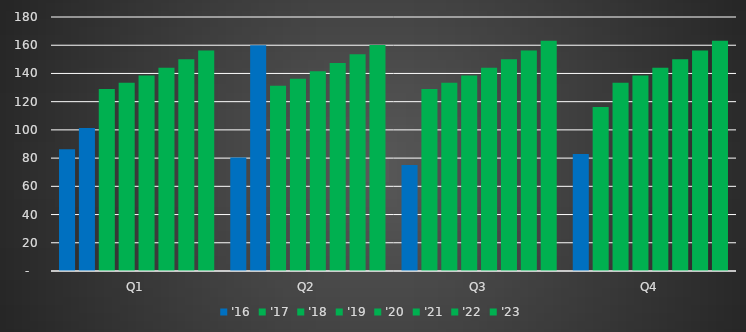
| Category | '15 | '16 | '17 | '18 | '19 | '20 | '21 | '22 | '23 |
|---|---|---|---|---|---|---|---|---|---|
| Q1 |  | 86.35 | 101.35 | 128.9 | 133.474 | 138.608 | 144.111 | 150.012 | 156.342 |
| Q2 |  | 80.35 | 160.05 | 131.242 | 136.242 | 141.604 | 147.354 | 153.524 | 160.149 |
| Q3 |  | 75.05 | 128.9 | 133.474 | 138.608 | 144.111 | 150.012 | 156.342 | 163.136 |
| Q4 |  | 82.85 | 116.15 | 133.474 | 138.608 | 144.111 | 150.012 | 156.342 | 163.136 |